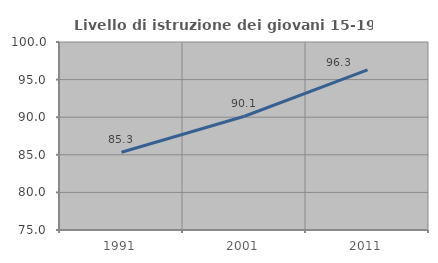
| Category | Livello di istruzione dei giovani 15-19 anni |
|---|---|
| 1991.0 | 85.343 |
| 2001.0 | 90.128 |
| 2011.0 | 96.288 |